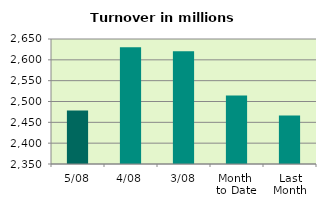
| Category | Series 0 |
|---|---|
| 5/08 | 2478.163 |
| 4/08 | 2630.074 |
| 3/08 | 2620.585 |
| Month 
to Date | 2514.336 |
| Last
Month | 2466.495 |